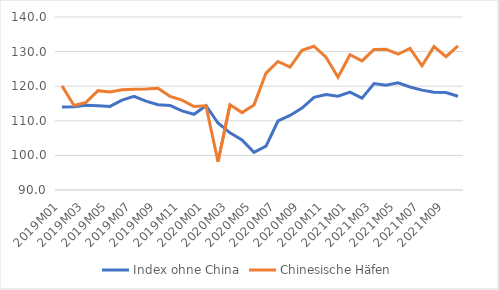
| Category | Index ohne China | Chinesische Häfen |
|---|---|---|
| 2019M01 | 114.024 | 120.101 |
| 2019M02 | 114.046 | 114.41 |
| 2019M03 | 114.511 | 115.328 |
| 2019M04 | 114.331 | 118.712 |
| 2019M05 | 114.157 | 118.329 |
| 2019M06 | 115.996 | 118.987 |
| 2019M07 | 117.062 | 119.115 |
| 2019M08 | 115.673 | 119.161 |
| 2019M09 | 114.641 | 119.4 |
| 2019M10 | 114.451 | 117.068 |
| 2019M11 | 112.872 | 115.971 |
| 2019M12 | 111.892 | 114.117 |
| 2020M01 | 114.362 | 114.324 |
| 2020M02 | 109.363 | 98.176 |
| 2020M03 | 106.511 | 114.623 |
| 2020M04 | 104.463 | 112.37 |
| 2020M05 | 100.874 | 114.595 |
| 2020M06 | 102.683 | 123.791 |
| 2020M07 | 109.942 | 127.16 |
| 2020M08 | 111.555 | 125.53 |
| 2020M09 | 113.681 | 130.352 |
| 2020M10 | 116.778 | 131.558 |
| 2020M11 | 117.596 | 128.396 |
| 2020M12 | 117.129 | 122.602 |
| 2021M01 | 118.269 | 129.09 |
| 2021M02 | 116.565 | 127.324 |
| 2021M03 | 120.781 | 130.585 |
| 2021M04 | 120.249 | 130.701 |
| 2021M05 | 120.979 | 129.241 |
| 2021M06 | 119.767 | 130.919 |
| 2021M07 | 118.866 | 125.897 |
| 2021M08 | 118.259 | 131.438 |
| 2021M09 | 118.185 | 128.529 |
| 2021M10 | 117.092 | 131.683 |